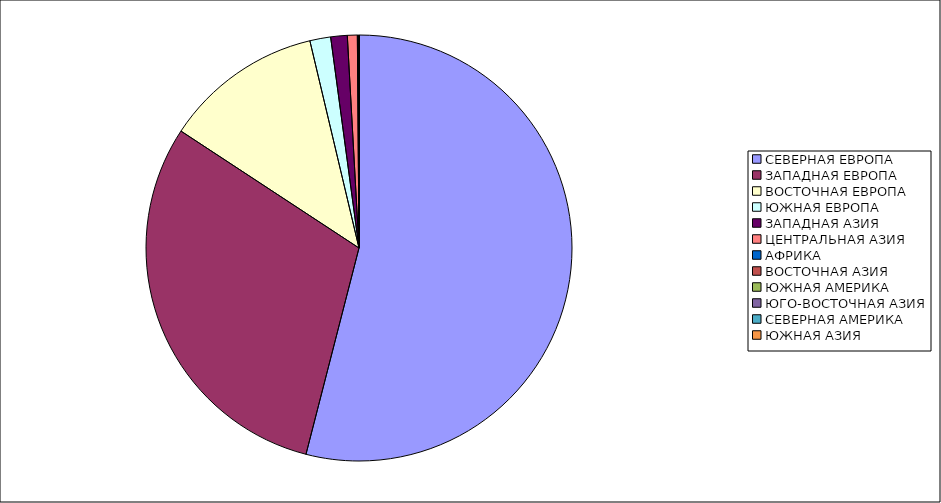
| Category | Оборот |
|---|---|
| СЕВЕРНАЯ ЕВРОПА | 54.004 |
| ЗАПАДНАЯ ЕВРОПА | 30.244 |
| ВОСТОЧНАЯ ЕВРОПА | 12.046 |
| ЮЖНАЯ ЕВРОПА | 1.577 |
| ЗАПАДНАЯ АЗИЯ | 1.254 |
| ЦЕНТРАЛЬНАЯ АЗИЯ | 0.752 |
| АФРИКА | 0.093 |
| ВОСТОЧНАЯ АЗИЯ | 0.023 |
| ЮЖНАЯ АМЕРИКА | 0.006 |
| ЮГО-ВОСТОЧНАЯ АЗИЯ | 0.001 |
| СЕВЕРНАЯ АМЕРИКА | 0 |
| ЮЖНАЯ АЗИЯ | 0 |